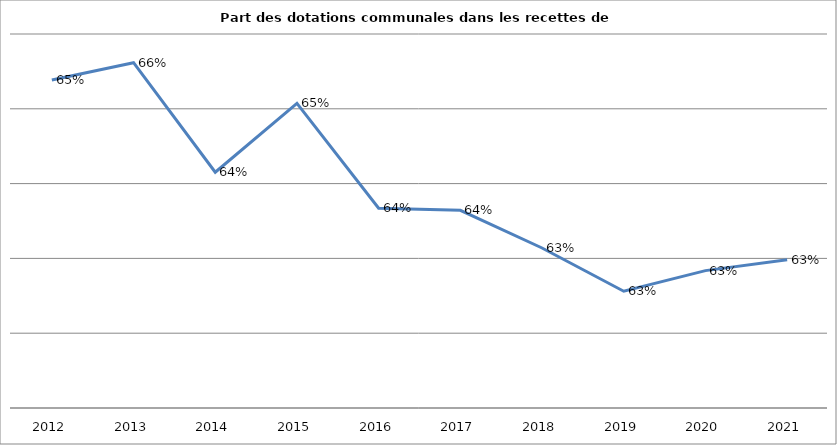
| Category | Series 0 |
|---|---|
| 2012.0 | 0.654 |
| 2013.0 | 0.656 |
| 2014.0 | 0.642 |
| 2015.0 | 0.651 |
| 2016.0 | 0.637 |
| 2017.0 | 0.636 |
| 2018.0 | 0.631 |
| 2019.0 | 0.626 |
| 2020.0 | 0.628 |
| 2021.0 | 0.63 |